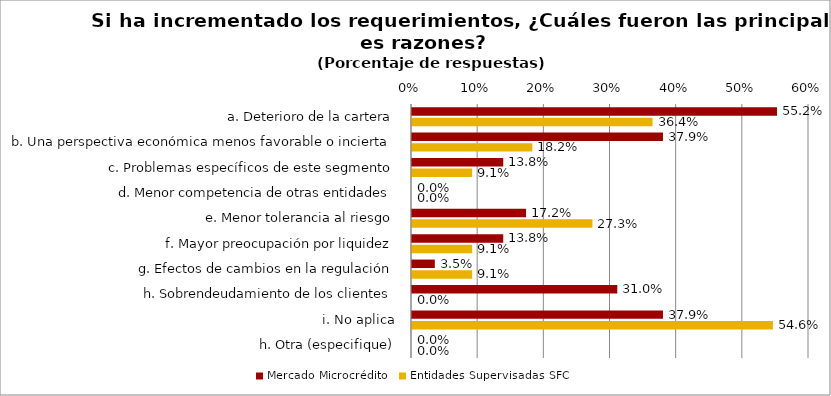
| Category | Mercado Microcrédito | Entidades Supervisadas SFC |
|---|---|---|
| a. Deterioro de la cartera | 0.552 | 0.364 |
| b. Una perspectiva económica menos favorable o incierta | 0.379 | 0.182 |
| c. Problemas específicos de este segmento | 0.138 | 0.091 |
| d. Menor competencia de otras entidades | 0 | 0 |
| e. Menor tolerancia al riesgo | 0.172 | 0.273 |
| f. Mayor preocupación por liquidez | 0.138 | 0.091 |
| g. Efectos de cambios en la regulación | 0.034 | 0.091 |
| h. Sobrendeudamiento de los clientes | 0.31 | 0 |
| i. No aplica | 0.379 | 0.546 |
| h. Otra (especifique) | 0 | 0 |